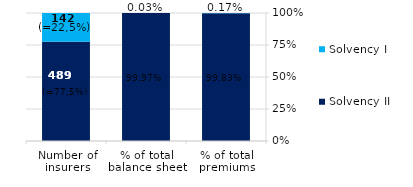
| Category | Solvency II | Solvency I |
|---|---|---|
| Number of insurers | 0.775 | 0.225 |
| % of total balance sheet | 1 | 0 |
| % of total premiums | 0.998 | 0.002 |